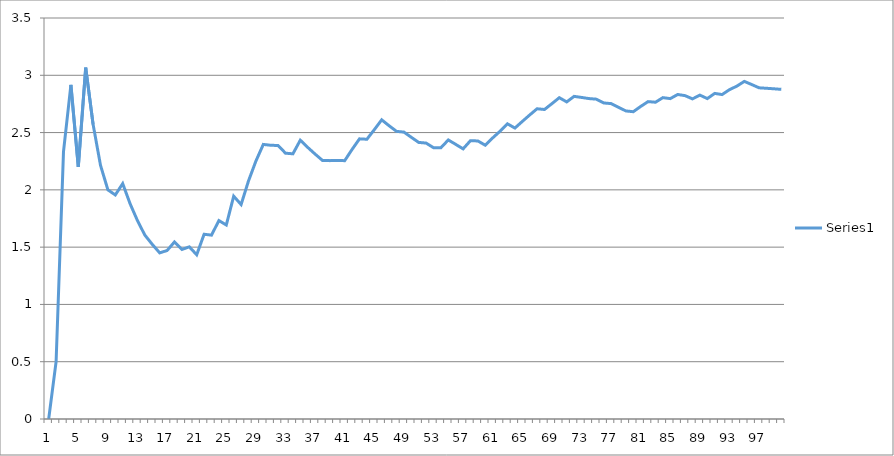
| Category | Series 0 |
|---|---|
| 0 | 0 |
| 1 | 0.5 |
| 2 | 2.333 |
| 3 | 2.917 |
| 4 | 2.2 |
| 5 | 3.067 |
| 6 | 2.571 |
| 7 | 2.214 |
| 8 | 2 |
| 9 | 1.956 |
| 10 | 2.055 |
| 11 | 1.879 |
| 12 | 1.731 |
| 13 | 1.604 |
| 14 | 1.524 |
| 15 | 1.45 |
| 16 | 1.471 |
| 17 | 1.546 |
| 18 | 1.48 |
| 19 | 1.503 |
| 20 | 1.433 |
| 21 | 1.613 |
| 22 | 1.605 |
| 23 | 1.732 |
| 24 | 1.693 |
| 25 | 1.945 |
| 26 | 1.872 |
| 27 | 2.078 |
| 28 | 2.251 |
| 29 | 2.397 |
| 30 | 2.389 |
| 31 | 2.387 |
| 32 | 2.32 |
| 33 | 2.315 |
| 34 | 2.434 |
| 35 | 2.371 |
| 36 | 2.312 |
| 37 | 2.257 |
| 38 | 2.255 |
| 39 | 2.256 |
| 40 | 2.255 |
| 41 | 2.353 |
| 42 | 2.445 |
| 43 | 2.442 |
| 44 | 2.525 |
| 45 | 2.611 |
| 46 | 2.56 |
| 47 | 2.511 |
| 48 | 2.504 |
| 49 | 2.459 |
| 50 | 2.414 |
| 51 | 2.408 |
| 52 | 2.368 |
| 53 | 2.368 |
| 54 | 2.436 |
| 55 | 2.397 |
| 56 | 2.358 |
| 57 | 2.43 |
| 58 | 2.427 |
| 59 | 2.39 |
| 60 | 2.454 |
| 61 | 2.512 |
| 62 | 2.576 |
| 63 | 2.539 |
| 64 | 2.597 |
| 65 | 2.654 |
| 66 | 2.708 |
| 67 | 2.701 |
| 68 | 2.752 |
| 69 | 2.804 |
| 70 | 2.768 |
| 71 | 2.816 |
| 72 | 2.807 |
| 73 | 2.797 |
| 74 | 2.792 |
| 75 | 2.758 |
| 76 | 2.753 |
| 77 | 2.721 |
| 78 | 2.689 |
| 79 | 2.682 |
| 80 | 2.728 |
| 81 | 2.77 |
| 82 | 2.765 |
| 83 | 2.805 |
| 84 | 2.796 |
| 85 | 2.832 |
| 86 | 2.822 |
| 87 | 2.794 |
| 88 | 2.827 |
| 89 | 2.797 |
| 90 | 2.842 |
| 91 | 2.832 |
| 92 | 2.875 |
| 93 | 2.906 |
| 94 | 2.947 |
| 95 | 2.919 |
| 96 | 2.891 |
| 97 | 2.887 |
| 98 | 2.882 |
| 99 | 2.877 |